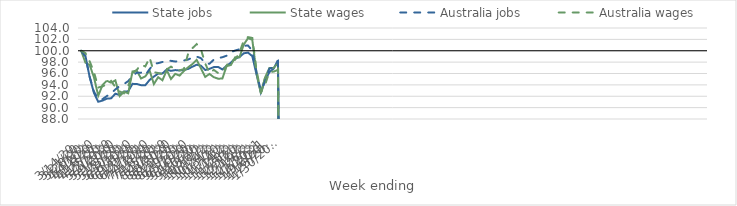
| Category | State jobs | State wages | Australia jobs | Australia wages |
|---|---|---|---|---|
| 14/03/2020 | 100 | 100 | 100 | 100 |
| 21/03/2020 | 99.126 | 97.922 | 98.956 | 99.595 |
| 28/03/2020 | 95.346 | 97.481 | 95.413 | 98.12 |
| 04/04/2020 | 92.564 | 95.312 | 92.814 | 96.244 |
| 11/04/2020 | 91.034 | 92.092 | 91.522 | 93.536 |
| 18/04/2020 | 91.236 | 93.98 | 91.5 | 93.735 |
| 25/04/2020 | 91.578 | 94.728 | 92.025 | 94.14 |
| 02/05/2020 | 91.635 | 94.365 | 92.519 | 94.693 |
| 09/05/2020 | 92.452 | 94.797 | 93.198 | 93.616 |
| 16/05/2020 | 92.208 | 92.043 | 93.788 | 92.845 |
| 23/05/2020 | 92.814 | 92.806 | 94.146 | 92.504 |
| 30/05/2020 | 92.868 | 92.517 | 94.65 | 93.808 |
| 06/06/2020 | 94.179 | 96.358 | 95.634 | 95.987 |
| 13/06/2020 | 94.158 | 96.517 | 96.135 | 96.641 |
| 20/06/2020 | 93.944 | 95.126 | 96.154 | 97.544 |
| 27/06/2020 | 93.942 | 95.507 | 95.728 | 97.236 |
| 04/07/2020 | 94.866 | 96.523 | 96.767 | 98.815 |
| 11/07/2020 | 95.459 | 94.135 | 97.729 | 96.243 |
| 18/07/2020 | 95.982 | 95.352 | 97.82 | 96.079 |
| 25/07/2020 | 96.014 | 94.811 | 98.028 | 95.887 |
| 01/08/2020 | 96.698 | 96.591 | 98.238 | 96.723 |
| 08/08/2020 | 96.461 | 95.034 | 98.223 | 97.204 |
| 15/08/2020 | 96.601 | 95.938 | 98.112 | 96.712 |
| 22/08/2020 | 96.525 | 95.632 | 98.158 | 96.554 |
| 29/08/2020 | 96.631 | 96.418 | 98.287 | 96.77 |
| 05/09/2020 | 96.804 | 97.085 | 98.443 | 99.477 |
| 12/09/2020 | 97.191 | 97.65 | 98.829 | 100.444 |
| 19/09/2020 | 97.54 | 98.384 | 98.97 | 101.162 |
| 26/09/2020 | 97.374 | 96.91 | 98.7 | 100.248 |
| 03/10/2020 | 96.609 | 95.406 | 97.765 | 97.757 |
| 10/10/2020 | 96.821 | 95.918 | 97.711 | 96.071 |
| 17/10/2020 | 97.125 | 95.352 | 98.435 | 96.645 |
| 24/10/2020 | 97.16 | 95.094 | 98.68 | 96.08 |
| 31/10/2020 | 96.71 | 95.105 | 98.863 | 96.206 |
| 07/11/2020 | 97.354 | 97.298 | 99.129 | 97.432 |
| 14/11/2020 | 97.894 | 97.491 | 99.776 | 98.33 |
| 21/11/2020 | 98.63 | 98.856 | 100.039 | 98.416 |
| 28/11/2020 | 98.887 | 98.845 | 100.264 | 99.694 |
| 05/12/2020 | 99.55 | 101.092 | 100.878 | 101.784 |
| 12/12/2020 | 99.677 | 102.217 | 100.916 | 102.402 |
| 19/12/2020 | 99.043 | 101.921 | 100.035 | 102.249 |
| 26/12/2020 | 95.813 | 96.057 | 96.089 | 96.528 |
| 02/01/2021 | 92.644 | 92.508 | 92.998 | 92.765 |
| 09/01/2021 | 94.758 | 95.308 | 94.651 | 94.062 |
| 16/01/2021 | 96.248 | 96.976 | 96.853 | 96.284 |
| 23/01/2021 | 96.869 | 97.001 | 97.109 | 96.336 |
| 30/01/2021 | 98.357 | 97.814 | 98.068 | 96.635 |